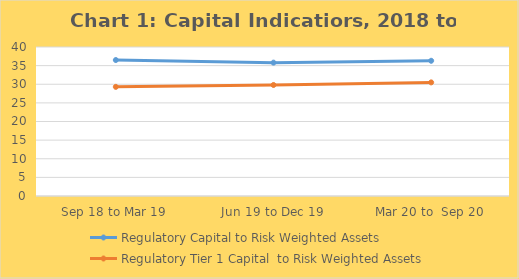
| Category | Regulatory Capital to Risk Weighted Assets | Regulatory Tier 1 Capital  to Risk Weighted Assets |
|---|---|---|
| Sep 18 to Mar 19 | 36.5 | 29.3 |
| Jun 19 to Dec 19 | 35.8 | 29.8 |
| Mar 20 to  Sep 20 | 36.3 | 30.5 |